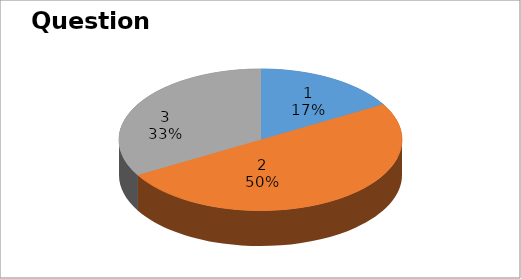
| Category | NIL |
|---|---|
| 0 | 1 |
| 1 | 3 |
| 2 | 2 |